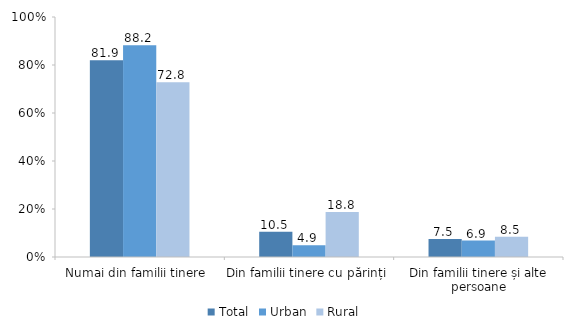
| Category | Total | Urban | Rural |
|---|---|---|---|
| Numai din familii tinere  | 81.932 | 88.204 | 72.767 |
| Din familii tinere cu părinți | 10.549 | 4.926 | 18.765 |
| Din familii tinere și alte persoane | 7.52 | 6.871 | 8.468 |